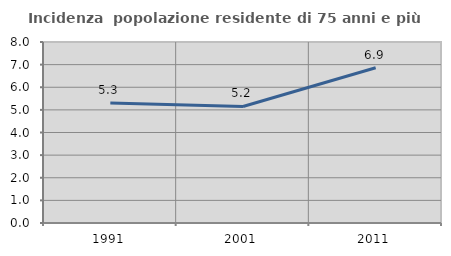
| Category | Incidenza  popolazione residente di 75 anni e più |
|---|---|
| 1991.0 | 5.298 |
| 2001.0 | 5.151 |
| 2011.0 | 6.859 |